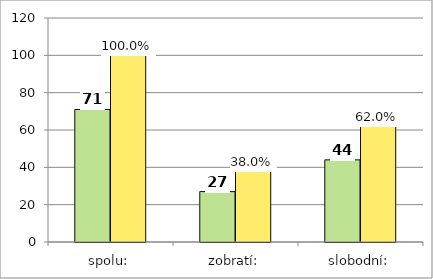
| Category | Series 0 | Series 1 |
|---|---|---|
| spolu: | 71 | 100 |
| zobratí: | 27 | 38.028 |
| slobodní: | 44 | 61.972 |